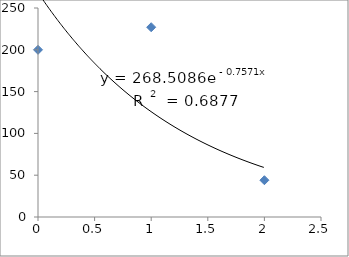
| Category | Series 0 |
|---|---|
| 0.0 | 200 |
| 1.0 | 227 |
| 2.0 | 44 |